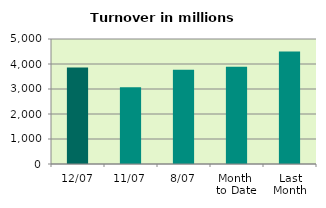
| Category | Series 0 |
|---|---|
| 12/07 | 3857.165 |
| 11/07 | 3067.014 |
| 8/07 | 3767.994 |
| Month 
to Date | 3892.409 |
| Last
Month | 4502.251 |